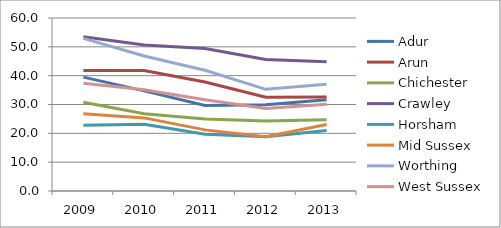
| Category | Adur | Arun | Chichester | Crawley | Horsham | Mid Sussex | Worthing | West Sussex |
|---|---|---|---|---|---|---|---|---|
| 2009.0 | 39.505 | 41.813 | 30.782 | 53.478 | 22.761 | 26.785 | 52.944 | 37.37 |
| 2010.0 | 34.728 | 41.806 | 26.817 | 50.648 | 23.149 | 25.352 | 46.839 | 35.095 |
| 2011.0 | 29.69 | 37.821 | 25.01 | 49.433 | 19.667 | 21.2 | 41.858 | 31.627 |
| 2012.0 | 29.934 | 32.534 | 24.282 | 45.594 | 18.823 | 18.803 | 35.267 | 28.648 |
| 2013.0 | 31.646 | 32.608 | 24.694 | 44.791 | 20.952 | 23.062 | 36.991 | 30.051 |